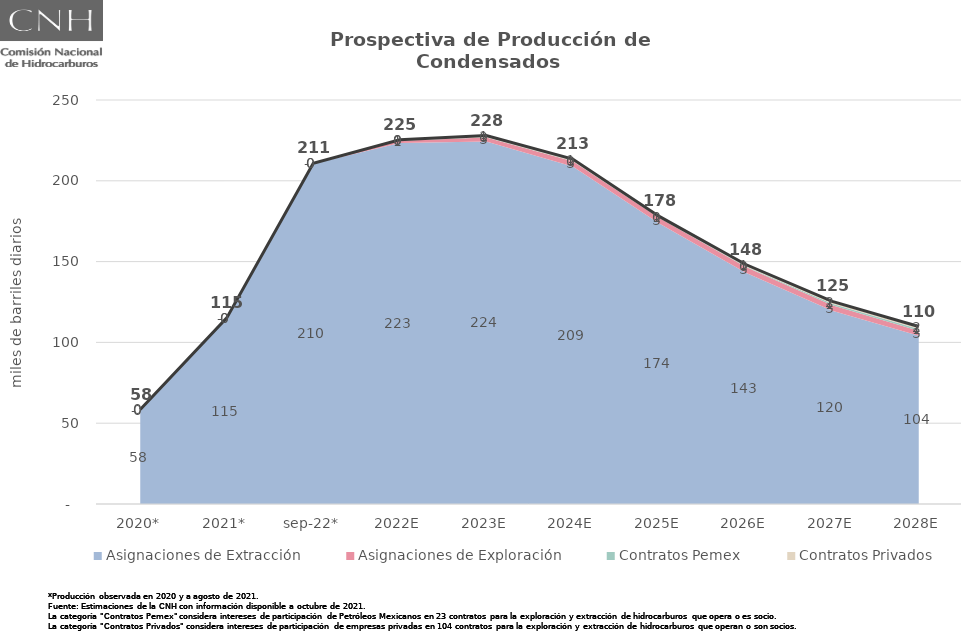
| Category | Total |
|---|---|
| 2020* | 58.421 |
| 2021* | 115.166 |
| sep-22* | 210.883 |
| 2022E | 225.356 |
| 2023E | 227.997 |
| 2024E | 213.428 |
| 2025E | 177.962 |
| 2026E | 148.19 |
| 2027E | 125.412 |
| 2028E | 109.839 |